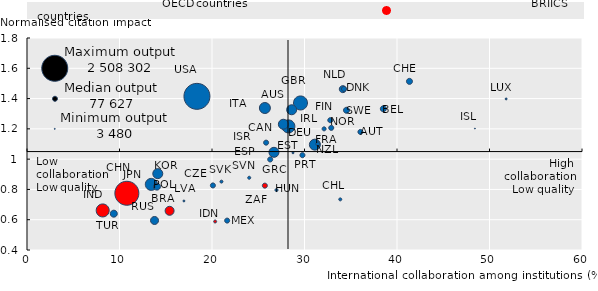
| Category | International collaboration among institutions |
|---|---|
| 18.371196687221527 | 1.415 |
| 10.75762614607811 | 0.777 |
| 29.514909386634823 | 1.374 |
| 28.22560489177704 | 1.218 |
| 8.138277381658554 | 0.664 |
| 13.437556028366087 | 0.833 |
| 31.083438992500305 | 1.098 |
| 25.668798685073853 | 1.341 |
| 27.69201695919037 | 1.232 |
| 14.100651144981386 | 0.907 |
| 26.65372848510742 | 1.048 |
| 28.562268614768982 | 1.329 |
| 15.389718413352965 | 0.66 |
| 13.781491816043854 | 0.595 |
| 34.1350764036178 | 1.462 |
| 9.373958110809326 | 0.64 |
| 14.016301333904266 | 0.82 |
| 41.32818281650543 | 1.515 |
| 34.51322913169861 | 1.324 |
| 38.4699022769928 | 1.336 |
| 29.75502908229828 | 1.028 |
| 20.072190761566162 | 0.828 |
| 34.23657953739166 | 1.465 |
| 21.60817801952362 | 0.596 |
| 36.010040044784546 | 1.182 |
| 25.808456540107727 | 1.111 |
| 26.247756481170654 | 1.001 |
| 25.665225684642788 | 0.828 |
| 32.736947536468506 | 1.26 |
| 32.83819377422333 | 1.21 |
| 31.420350074768066 | 1.102 |
| 32.08306849002838 | 1.202 |
| 26.970047354698178 | 0.796 |
| 33.865370750427246 | 0.734 |
| 21.00016176700592 | 0.853 |
| 20.314967930316925 | 0.59 |
| 23.985385596752167 | 0.879 |
| 28.73199999332428 | 1.043 |
| 16.927859485149384 | 0.726 |
| 51.74825906753539 | 1.401 |
| 48.422812819480896 | 1.202 |
| 3.0 | 1.6 |
| 3.0 | 1.4 |
| 3.0 | 1.2 |